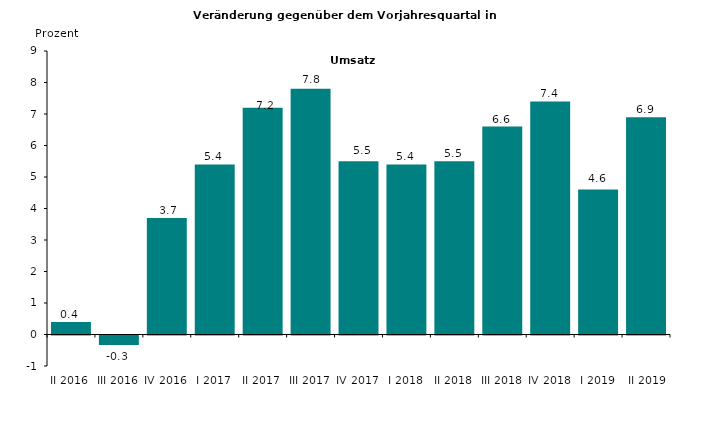
| Category | Series 0 |
|---|---|
| II 2016 | 0.4 |
| III 2016 | -0.3 |
| IV 2016 | 3.7 |
| I 2017 | 5.4 |
| II 2017 | 7.2 |
| III 2017 | 7.8 |
| IV 2017 | 5.5 |
| I 2018 | 5.4 |
| II 2018 | 5.5 |
| III 2018 | 6.6 |
| IV 2018 | 7.4 |
| I 2019 | 4.6 |
|  II 2019 | 6.9 |